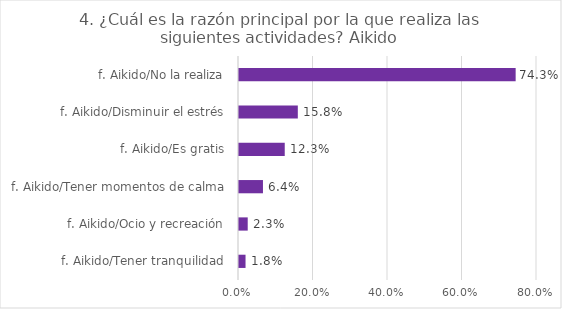
| Category | Series 0 |
|---|---|
| f. Aikido/Tener tranquilidad | 0.018 |
| f. Aikido/Ocio y recreación | 0.023 |
| f. Aikido/Tener momentos de calma | 0.064 |
| f. Aikido/Es gratis | 0.123 |
| f. Aikido/Disminuir el estrés | 0.158 |
| f. Aikido/No la realiza | 0.743 |